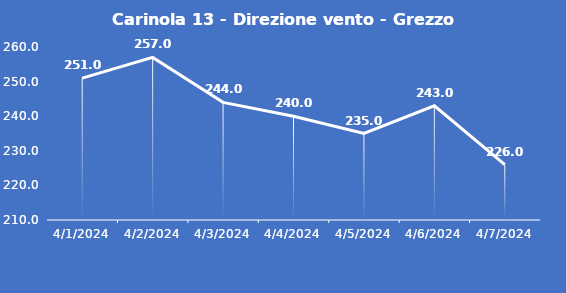
| Category | Carinola 13 - Direzione vento - Grezzo (°N) |
|---|---|
| 4/1/24 | 251 |
| 4/2/24 | 257 |
| 4/3/24 | 244 |
| 4/4/24 | 240 |
| 4/5/24 | 235 |
| 4/6/24 | 243 |
| 4/7/24 | 226 |